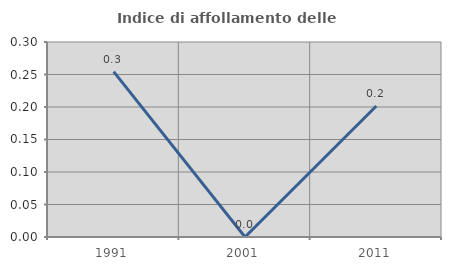
| Category | Indice di affollamento delle abitazioni  |
|---|---|
| 1991.0 | 0.254 |
| 2001.0 | 0 |
| 2011.0 | 0.202 |